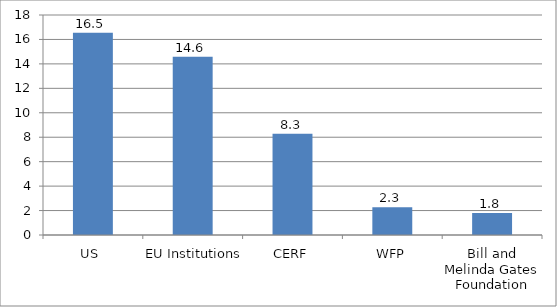
| Category | US$ millions |
|---|---|
| US  | 16.544 |
| EU Institutions | 14.593 |
| CERF | 8.289 |
| WFP | 2.277 |
| Bill and Melinda Gates Foundation | 1.8 |